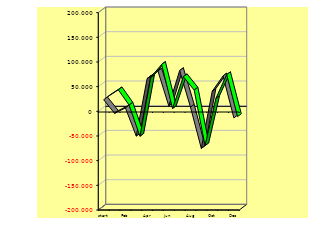
| Category | NEW | Actual |
|---|---|---|
| start.balance | 21459 | 21459 |
| Jan | 35792.333 | -6207.667 |
| Feb | 4792.333 | 4792.333 |
| Mar | -58207.667 | -52207.667 |
| Apr | 61292.333 | 64292.333 |
| May | 87359 | 79559 |
| Jun | -1941 | 8859 |
| Jul | 62459 | 80459 |
| Aug | 35192.333 | 6392.333 |
| Sep | -77207.667 | -77207.667 |
| Oct | 18559 | 38359 |
| Nov | 66625.667 | 69625.667 |
| Dec | -18374.333 | -15374.333 |